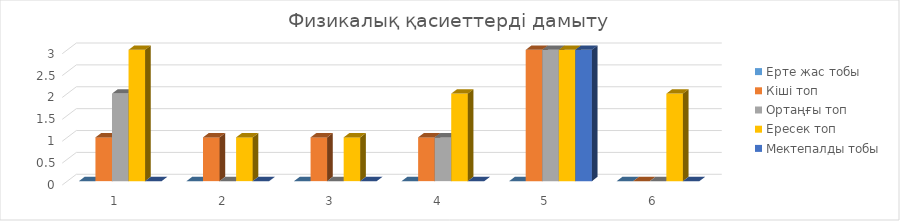
| Category | Ерте жас тобы  | Кіші топ | Ортаңғы топ | Ересек топ | Мектепалды тобы |
|---|---|---|---|---|---|
| 0 | 0 | 1 | 2 | 3 | 0 |
| 1 | 0 | 1 | 0 | 1 | 0 |
| 2 | 0 | 1 | 0 | 1 | 0 |
| 3 | 0 | 1 | 1 | 2 | 0 |
| 4 | 0 | 3 | 3 | 3 | 3 |
| 5 | 0 | 0 | 0 | 2 | 0 |